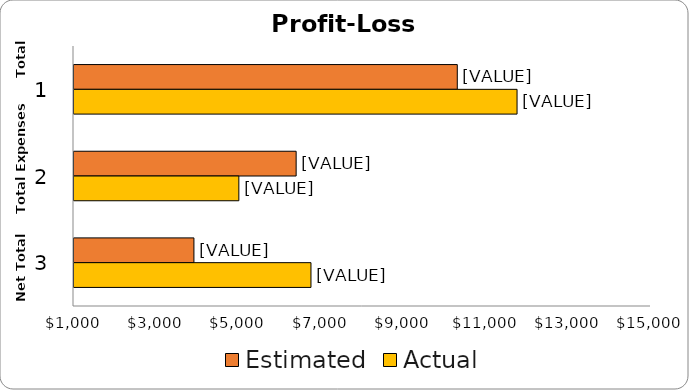
| Category | Estimated | Actual |
|---|---|---|
| 0 | 10300 | 11750 |
| 1 | 6390 | 5000 |
| 2 | 3910 | 6750 |